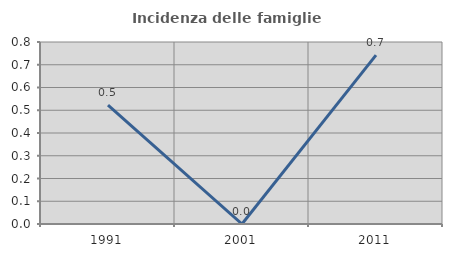
| Category | Incidenza delle famiglie numerose |
|---|---|
| 1991.0 | 0.522 |
| 2001.0 | 0 |
| 2011.0 | 0.743 |